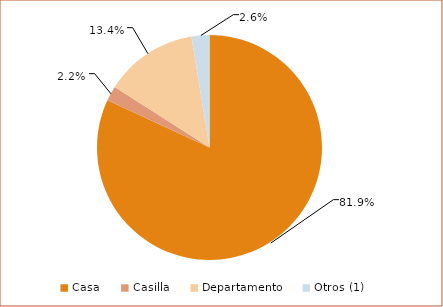
| Category | Series 0 |
|---|---|
| Casa | 130466 |
| Casilla | 3425 |
| Departamento | 21312 |
| Otros (1) | 4099 |